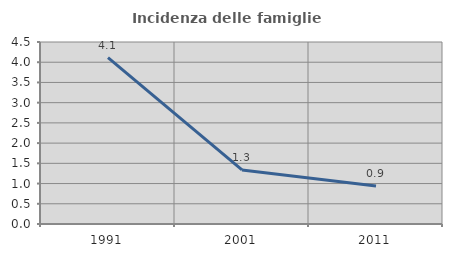
| Category | Incidenza delle famiglie numerose |
|---|---|
| 1991.0 | 4.112 |
| 2001.0 | 1.337 |
| 2011.0 | 0.94 |